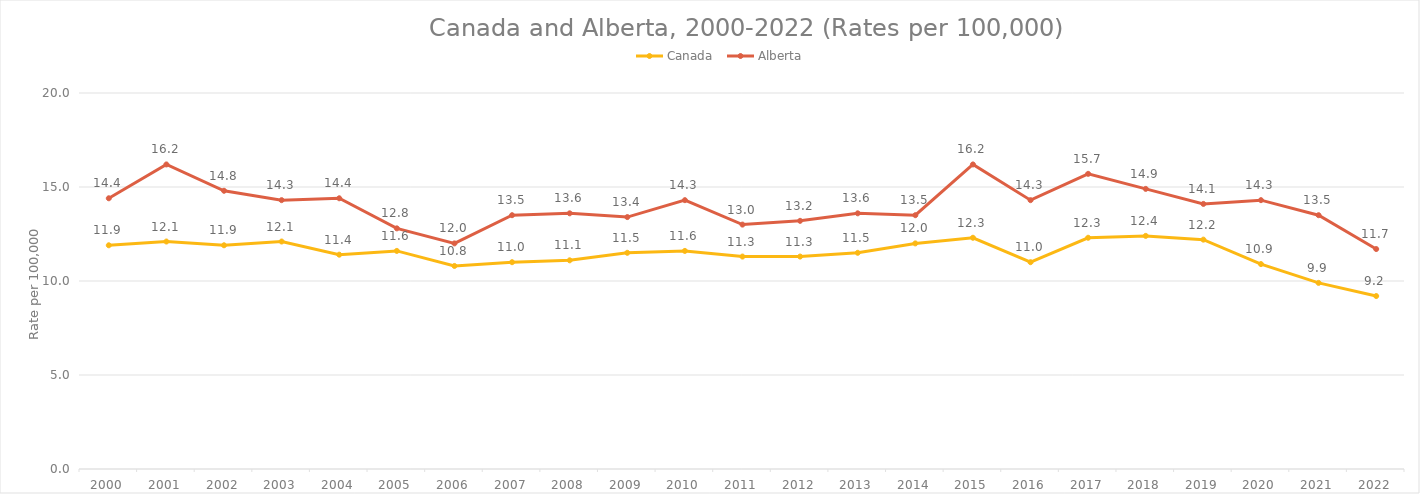
| Category | Canada  | Alberta |
|---|---|---|
| 2000 | 11.9 | 14.4 |
| 2001 | 12.1 | 16.2 |
| 2002 | 11.9 | 14.8 |
| 2003 | 12.1 | 14.3 |
| 2004 | 11.4 | 14.4 |
| 2005 | 11.6 | 12.8 |
| 2006 | 10.8 | 12 |
| 2007 | 11 | 13.5 |
| 2008 | 11.1 | 13.6 |
| 2009 | 11.5 | 13.4 |
| 2010 | 11.6 | 14.3 |
| 2011 | 11.3 | 13 |
| 2012 | 11.3 | 13.2 |
| 2013 | 11.5 | 13.6 |
| 2014 | 12 | 13.5 |
| 2015 | 12.3 | 16.2 |
| 2016 | 11 | 14.3 |
| 2017 | 12.3 | 15.7 |
| 2018 | 12.4 | 14.9 |
| 2019 | 12.2 | 14.1 |
| 2020 | 10.9 | 14.3 |
| 2021 | 9.9 | 13.5 |
| 2022 | 9.2 | 11.7 |